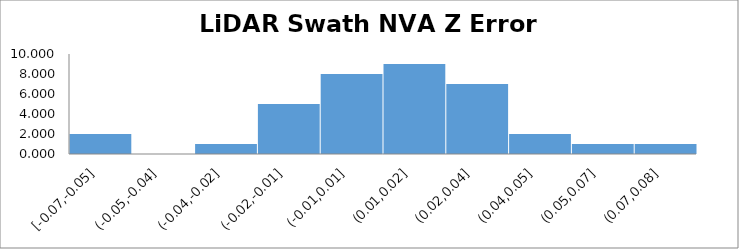
| Category | Series 0 |
|---|---|
| 0 | -0.066 |
| 1 | -0.058 |
| 2 | -0.024 |
| 3 | -0.017 |
| 4 | -0.016 |
| 5 | -0.015 |
| 6 | -0.015 |
| 7 | -0.011 |
| 8 | -0.003 |
| 9 | -0.003 |
| 10 | -0.001 |
| 11 | 0.001 |
| 12 | 0.003 |
| 13 | 0.005 |
| 14 | 0.007 |
| 15 | 0.008 |
| 16 | 0.013 |
| 17 | 0.015 |
| 18 | 0.015 |
| 19 | 0.018 |
| 20 | 0.019 |
| 21 | 0.02 |
| 22 | 0.021 |
| 23 | 0.023 |
| 24 | 0.023 |
| 25 | 0.025 |
| 26 | 0.025 |
| 27 | 0.027 |
| 28 | 0.03 |
| 29 | 0.03 |
| 30 | 0.036 |
| 31 | 0.036 |
| 32 | 0.043 |
| 33 | 0.048 |
| 34 | 0.058 |
| 35 | 0.077 |
| 36 | 0.083 |